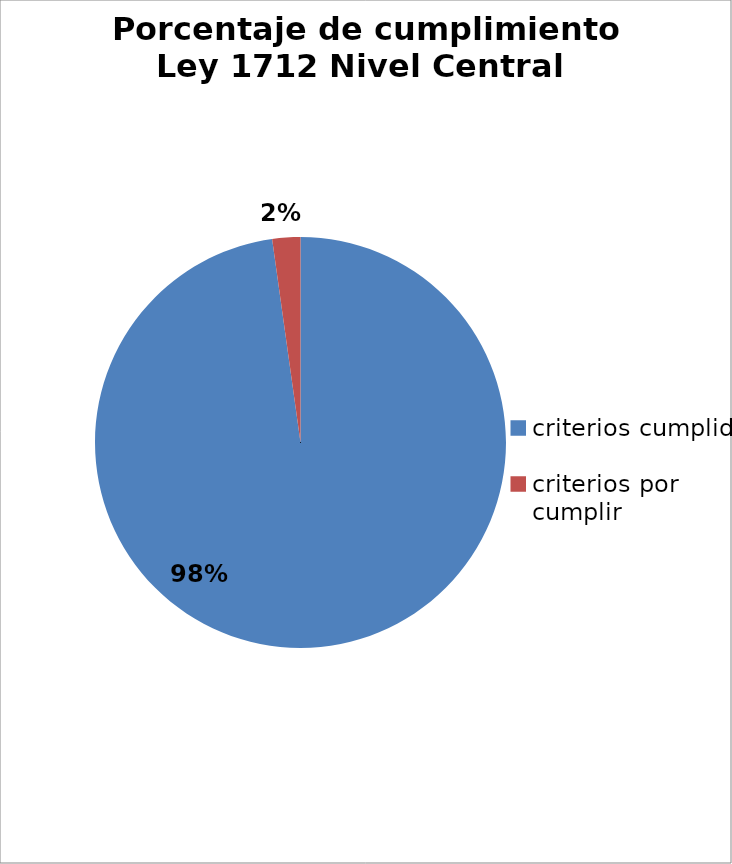
| Category | Series 0 |
|---|---|
| criterios cumplidos | 133 |
| criterios por cumplir | 3 |